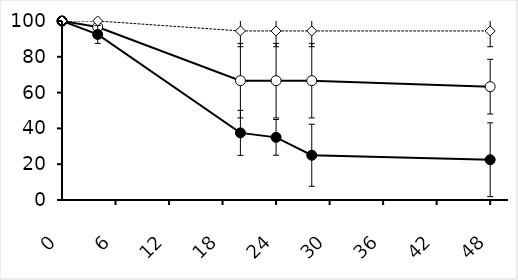
| Category | Series 0 | Series 1 | GC broth |
|---|---|---|---|
| 0.0 | 100 | 100 | 100 |
| 4.0 | 96.667 | 92.5 | 100 |
| 20.0 | 66.667 | 37.5 | 94.444 |
| 24.0 | 66.667 | 35 | 94.444 |
| 28.0 | 66.667 | 25 | 94.444 |
| 48.0 | 63.333 | 22.5 | 94.444 |